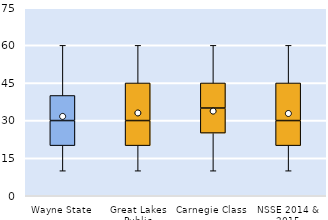
| Category | 25th | 50th | 75th |
|---|---|---|---|
| Wayne State | 20 | 10 | 10 |
| Great Lakes Public | 20 | 10 | 15 |
| Carnegie Class | 25 | 10 | 10 |
| NSSE 2014 & 2015 | 20 | 10 | 15 |